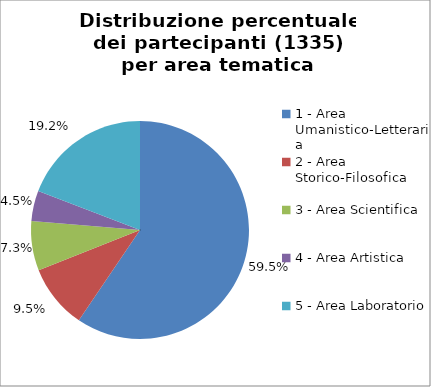
| Category | Nr. Partecipanti |
|---|---|
| 1 - Area Umanistico-Letteraria | 794 |
| 2 - Area Storico-Filosofica | 127 |
| 3 - Area Scientifica | 98 |
| 4 - Area Artistica | 60 |
| 5 - Area Laboratorio | 256 |